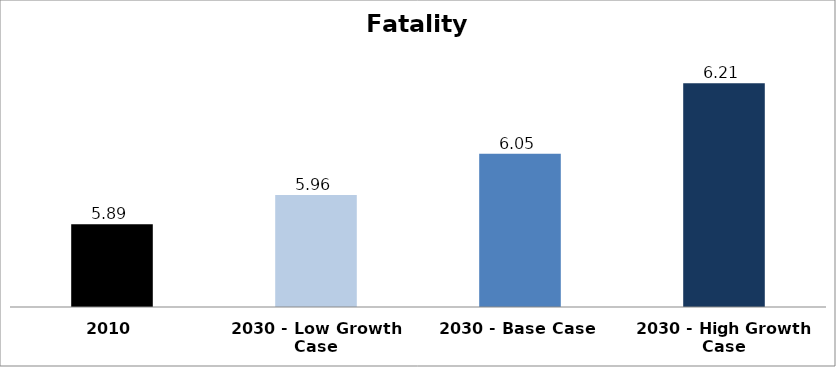
| Category | Fatality Rate |
|---|---|
| 2010 | 5.89 |
| 2030 - Low Growth Case | 5.958 |
| 2030 - Base Case | 6.052 |
| 2030 - High Growth Case | 6.215 |